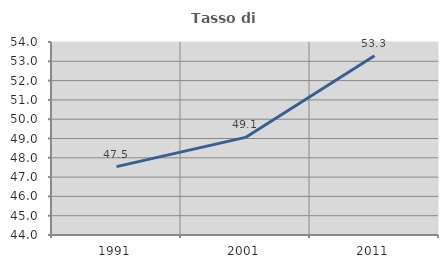
| Category | Tasso di occupazione   |
|---|---|
| 1991.0 | 47.541 |
| 2001.0 | 49.057 |
| 2011.0 | 53.285 |